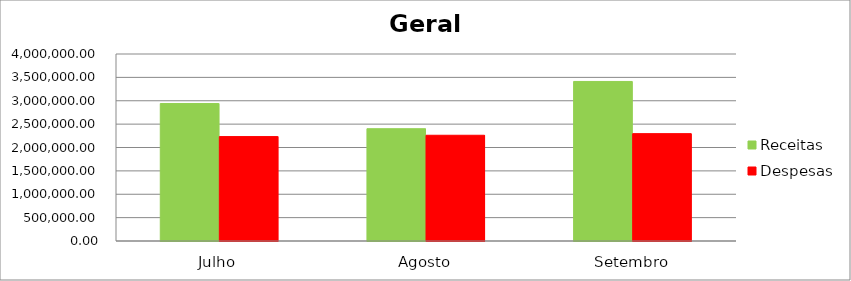
| Category | Receitas | Despesas |
|---|---|---|
| Julho | 2940133.92 | 2233501.4 |
| Agosto | 2401852.63 | 2261764.93 |
| Setembro | 3412675.64 | 2296519.4 |